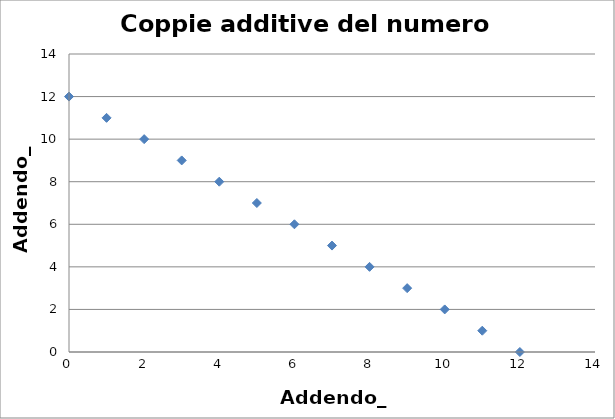
| Category | Addendo-2 |
|---|---|
| 0.0 | 12 |
| 1.0 | 11 |
| 2.0 | 10 |
| 3.0 | 9 |
| 4.0 | 8 |
| 5.0 | 7 |
| 6.0 | 6 |
| 7.0 | 5 |
| 8.0 | 4 |
| 9.0 | 3 |
| 10.0 | 2 |
| 11.0 | 1 |
| 12.0 | 0 |